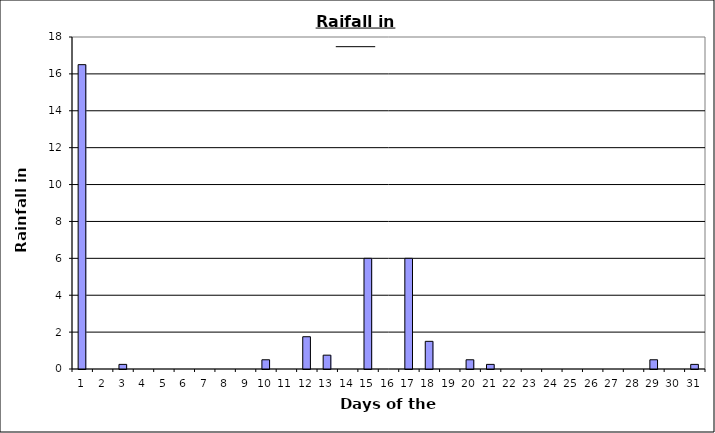
| Category | Series 0 |
|---|---|
| 0 | 16.5 |
| 1 | 0 |
| 2 | 0.25 |
| 3 | 0 |
| 4 | 0 |
| 5 | 0 |
| 6 | 0 |
| 7 | 0 |
| 8 | 0 |
| 9 | 0.5 |
| 10 | 0 |
| 11 | 1.75 |
| 12 | 0.75 |
| 13 | 0 |
| 14 | 6 |
| 15 | 0 |
| 16 | 6 |
| 17 | 1.5 |
| 18 | 0 |
| 19 | 0.5 |
| 20 | 0.25 |
| 21 | 0 |
| 22 | 0 |
| 23 | 0 |
| 24 | 0 |
| 25 | 0 |
| 26 | 0 |
| 27 | 0 |
| 28 | 0.5 |
| 29 | 0 |
| 30 | 0.25 |